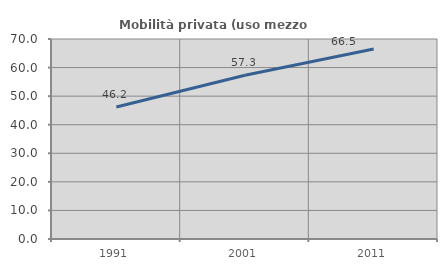
| Category | Mobilità privata (uso mezzo privato) |
|---|---|
| 1991.0 | 46.226 |
| 2001.0 | 57.295 |
| 2011.0 | 66.507 |